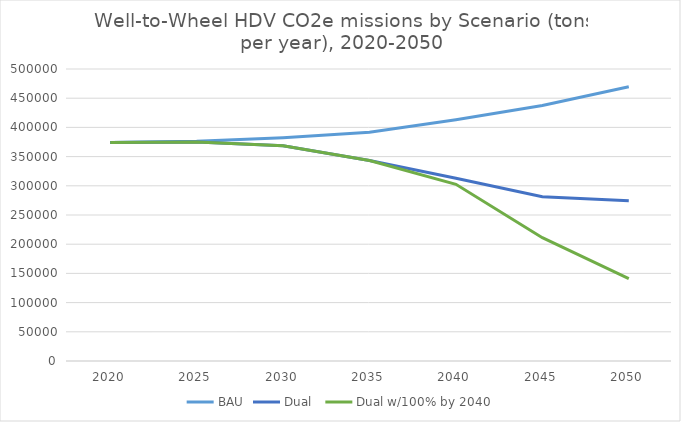
| Category | BAU | Dual  | Dual w/100% by 2040 |
|---|---|---|---|
| 2020.0 | 373970.52 | 373970.52 | 373970.52 |
| 2025.0 | 376180.002 | 375171.259 | 375171.259 |
| 2030.0 | 382394.231 | 368434.943 | 368434.943 |
| 2035.0 | 391836.04 | 343290.362 | 343290.362 |
| 2040.0 | 413137.749 | 312880.476 | 302488.135 |
| 2045.0 | 437474.636 | 281189.412 | 211124.338 |
| 2050.0 | 469572.545 | 274318.644 | 141180.731 |